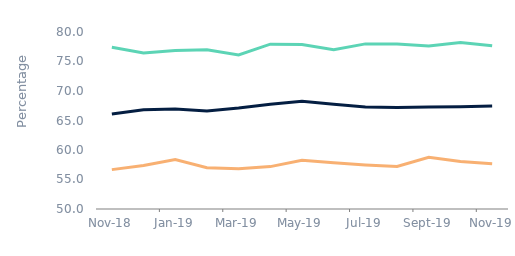
| Category | First-time
buyers | Homemovers | Remortgagers |
|---|---|---|---|
| 2018-11-01 | 77.401 | 66.092 | 56.673 |
| 2018-12-01 | 76.439 | 66.825 | 57.388 |
| 2019-01-01 | 76.859 | 66.946 | 58.365 |
| 2019-02-01 | 77.008 | 66.62 | 56.99 |
| 2019-03-01 | 76.096 | 67.116 | 56.84 |
| 2019-04-01 | 77.936 | 67.77 | 57.184 |
| 2019-05-01 | 77.866 | 68.246 | 58.261 |
| 2019-06-01 | 76.987 | 67.744 | 57.855 |
| 2019-07-01 | 77.986 | 67.28 | 57.472 |
| 2019-08-01 | 77.964 | 67.2 | 57.206 |
| 2019-09-01 | 77.611 | 67.27 | 58.751 |
| 2019-10-01 | 78.229 | 67.34 | 58.035 |
| 2019-11-01 | 77.652 | 67.474 | 57.665 |